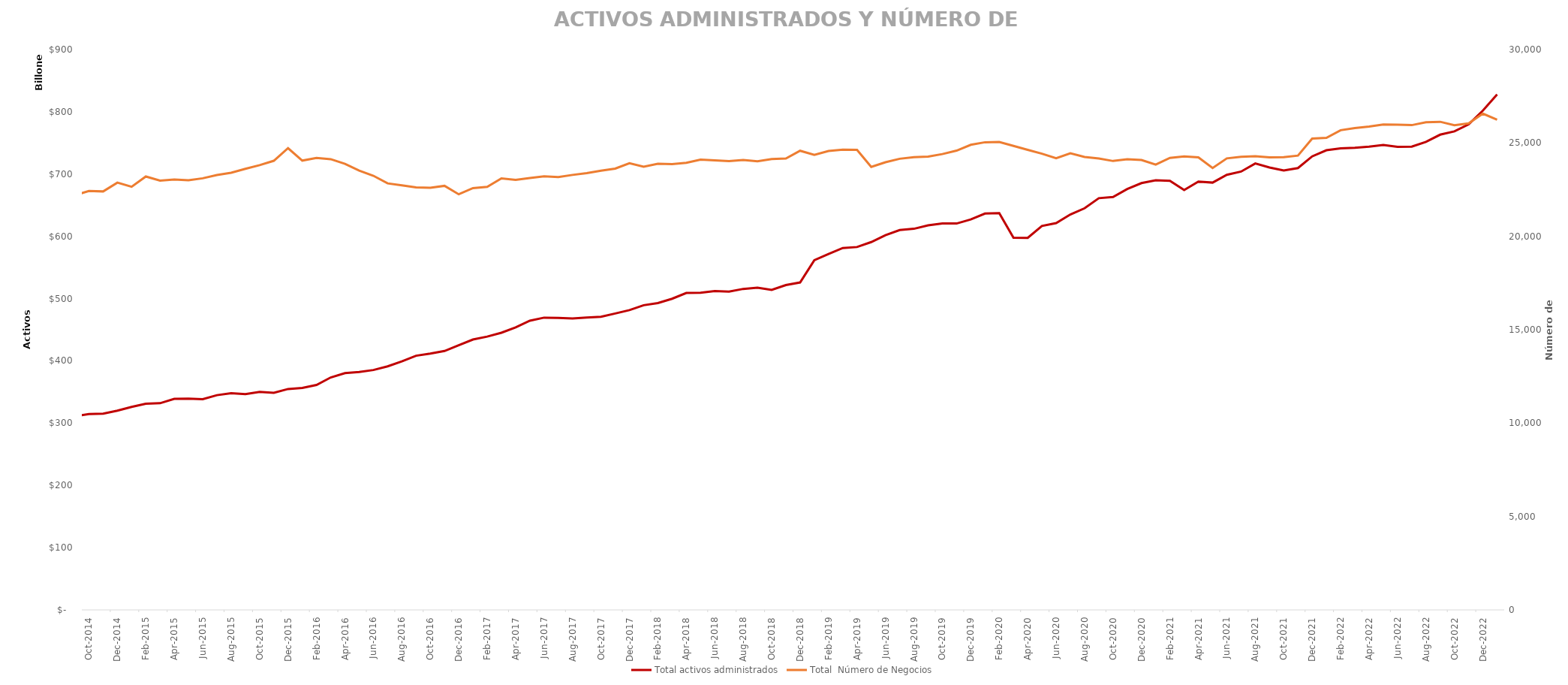
| Category | Total activos administrados |
|---|---|
| 2014-01-01 | 275831100.32 |
| 2014-02-01 | 282540287.38 |
| 2014-03-01 | 293725410.34 |
| 2014-04-01 | 297083130.06 |
| 2014-05-01 | 299989040.55 |
| 2014-06-01 | 299856845.58 |
| 2014-07-01 | 304100994.88 |
| 2014-08-01 | 315107203.45 |
| 2014-09-01 | 310941517.35 |
| 2014-10-01 | 314517386.46 |
| 2014-11-01 | 315319470.57 |
| 2014-12-01 | 320028520.24 |
| 2015-01-01 | 326117158.47 |
| 2015-02-01 | 331144520.36 |
| 2015-03-01 | 331981172.805 |
| 2015-04-01 | 338926238.767 |
| 2015-05-01 | 339240079.978 |
| 2015-06-01 | 338507344.528 |
| 2015-07-01 | 344906623.679 |
| 2015-08-01 | 347934876.102 |
| 2015-09-01 | 346437581.721 |
| 2015-10-01 | 350288175.716 |
| 2015-11-01 | 348695859.246 |
| 2015-12-01 | 354836337.141 |
| 2016-01-01 | 356608868.945 |
| 2016-02-01 | 361371487.01 |
| 2016-03-01 | 373359908.982 |
| 2016-04-01 | 380293748.088 |
| 2016-05-01 | 382057296.776 |
| 2016-06-01 | 385284005.51 |
| 2016-07-01 | 391162222.786 |
| 2016-08-01 | 399100246.403 |
| 2016-09-01 | 408243528.619 |
| 2016-10-01 | 411681112.939 |
| 2016-11-01 | 415877569.787 |
| 2016-12-01 | 425216779.143 |
| 2017-01-01 | 434258404.05 |
| 2017-02-01 | 438987856.756 |
| 2017-03-01 | 445157660.961 |
| 2017-04-01 | 453702785.873 |
| 2017-05-01 | 464497841.829 |
| 2017-06-01 | 469415788.649 |
| 2017-07-01 | 468962799.85 |
| 2017-08-01 | 468143792.161 |
| 2017-09-01 | 469727845.072 |
| 2017-10-01 | 470813763.716 |
| 2017-11-01 | 476084556.132 |
| 2017-12-01 | 481507641 |
| 2018-01-01 | 489352745 |
| 2018-02-01 | 492886628.093 |
| 2018-03-01 | 499799870.286 |
| 2018-04-01 | 509038822.941 |
| 2018-05-01 | 509341122.338 |
| 2018-06-01 | 512175223.444 |
| 2018-07-01 | 511213443.142 |
| 2018-08-01 | 515588338.106 |
| 2018-09-01 | 517468154.4 |
| 2018-10-01 | 513959839.346 |
| 2018-11-01 | 521784789.471 |
| 2018-12-01 | 525928025.494 |
| 2019-01-01 | 561800639.859 |
| 2019-02-01 | 571578939.256 |
| 2019-03-01 | 581325145.256 |
| 2019-04-01 | 582838730.822 |
| 2019-05-01 | 590827846.86 |
| 2019-06-01 | 601936170.817 |
| 2019-07-01 | 610096294.565 |
| 2019-08-01 | 612140239.027 |
| 2019-09-01 | 617592572.435 |
| 2019-10-01 | 620638755.372 |
| 2019-11-01 | 620586121.495 |
| 2019-12-01 | 627250437.809 |
| 2020-01-01 | 636706668.633 |
| 2020-02-01 | 637198516.488 |
| 2020-03-01 | 597723884.646 |
| 2020-04-01 | 597600675.349 |
| 2020-05-01 | 616751030.203 |
| 2020-06-01 | 621198055.701 |
| 2020-07-01 | 635091274.008 |
| 2020-08-01 | 645093768.784 |
| 2020-09-01 | 661306941.69 |
| 2020-10-01 | 663299299.526 |
| 2020-11-01 | 676074287.005 |
| 2020-12-01 | 685532677.99 |
| 2021-01-01 | 690054991.119 |
| 2021-02-01 | 689209474 |
| 2021-03-01 | 674411742 |
| 2021-04-01 | 688056860 |
| 2021-05-01 | 686344745 |
| 2021-06-01 | 698900940 |
| 2021-07-01 | 704023453 |
| 2021-08-01 | 717123710 |
| 2021-09-01 | 710522026 |
| 2021-10-01 | 705830872 |
| 2021-11-01 | 709659656 |
| 2021-12-01 | 728465533 |
| 2022-01-01 | 738257792.027 |
| 2022-02-01 | 741357389 |
| 2022-03-01 | 742190668 |
| 2022-04-01 | 744051639 |
| 2022-05-01 | 746820596 |
| 2022-06-01 | 743647441 |
| 2022-07-01 | 744073781 |
| 2022-08-01 | 751671713 |
| 2022-09-01 | 763317879 |
| 2022-10-01 | 768576147 |
| 2022-11-01 | 779807959 |
| 2022-12-01 | 801936667 |
| 2023-01-01 | 827802263 |